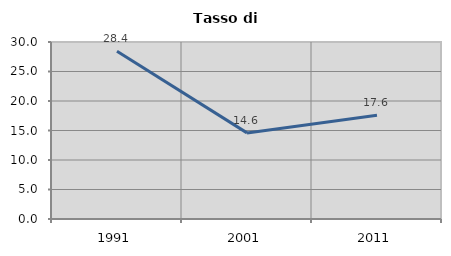
| Category | Tasso di disoccupazione   |
|---|---|
| 1991.0 | 28.433 |
| 2001.0 | 14.595 |
| 2011.0 | 17.6 |